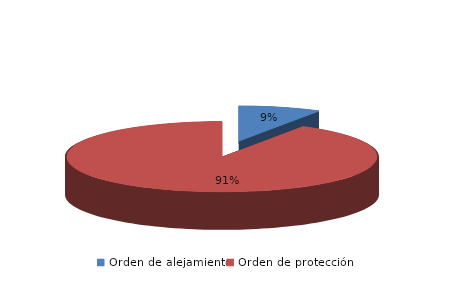
| Category | Series 0 |
|---|---|
| Orden de alejamiento | 21 |
| Orden de protección | 225 |